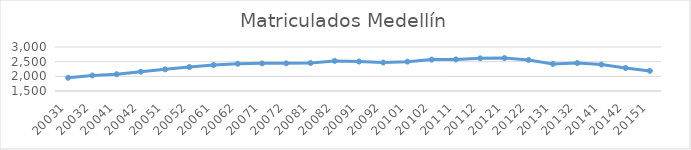
| Category | Matriculados Medellín |
|---|---|
| 20031 | 1951 |
| 20032 | 2029 |
| 20041 | 2071 |
| 20042 | 2157 |
| 20051 | 2238 |
| 20052 | 2318 |
| 20061 | 2385 |
| 20062 | 2429 |
| 20071 | 2442 |
| 20072 | 2444 |
| 20081 | 2456 |
| 20082 | 2525 |
| 20091 | 2504 |
| 20092 | 2470 |
| 20101 | 2501 |
| 20102 | 2571 |
| 20111 | 2576 |
| 20112 | 2613 |
| 20121 | 2621 |
| 20122 | 2557 |
| 20131 | 2423 |
| 20132 | 2453 |
| 20141 | 2402 |
| 20142 | 2284 |
| 20151 | 2185 |